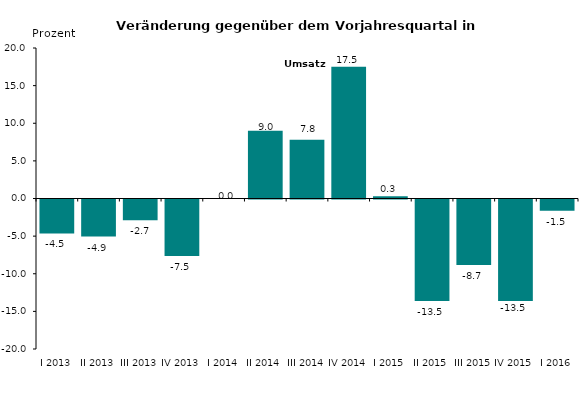
| Category | Series 0 |
|---|---|
| I 2013 | -4.513 |
| II 2013 | -4.922 |
| III 2013 | -2.749 |
| IV 2013 | -7.5 |
| I 2014 | 0 |
| II 2014 | 9 |
| III 2014 | 7.8 |
| IV 2014 | 17.5 |
| I 2015 | 0.3 |
| II 2015 | -13.5 |
| III 2015 | -8.7 |
| IV 2015 | -13.5 |
| I 2016 | -1.5 |